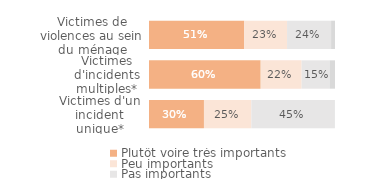
| Category | Plutôt voire très importants | Peu importants | Pas importants | Ne sait pas/Refus |
|---|---|---|---|---|
| Victimes d'un incident unique* | 0.295 | 0.255 | 0.448 | 0.001 |
| Victimes d'incidents multiples* | 0.601 | 0.22 | 0.151 | 0.029 |
| Victimes de violences au sein du ménage | 0.512 | 0.23 | 0.237 | 0.021 |